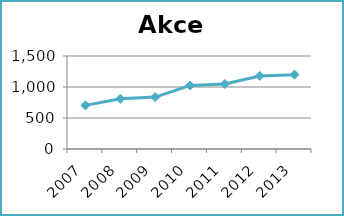
| Category | Akce |
|---|---|
| 2007.0 | 704 |
| 2008.0 | 809 |
| 2009.0 | 837 |
| 2010.0 | 1024 |
| 2011.0 | 1048 |
| 2012.0 | 1178 |
| 2013.0 | 1199 |